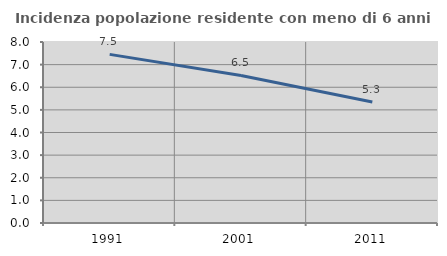
| Category | Incidenza popolazione residente con meno di 6 anni |
|---|---|
| 1991.0 | 7.452 |
| 2001.0 | 6.523 |
| 2011.0 | 5.347 |